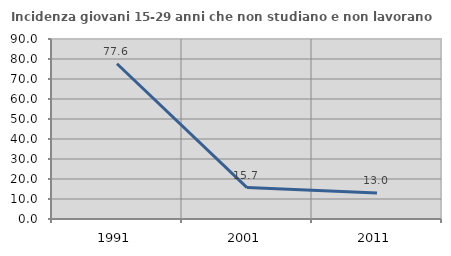
| Category | Incidenza giovani 15-29 anni che non studiano e non lavorano  |
|---|---|
| 1991.0 | 77.632 |
| 2001.0 | 15.73 |
| 2011.0 | 13.043 |